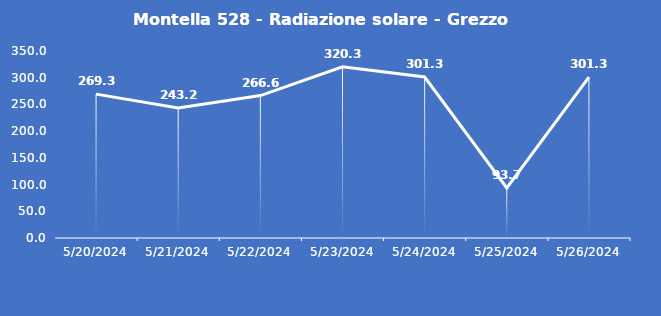
| Category | Montella 528 - Radiazione solare - Grezzo (W/m2) |
|---|---|
| 5/20/24 | 269.3 |
| 5/21/24 | 243.2 |
| 5/22/24 | 266.6 |
| 5/23/24 | 320.3 |
| 5/24/24 | 301.3 |
| 5/25/24 | 93.7 |
| 5/26/24 | 301.3 |